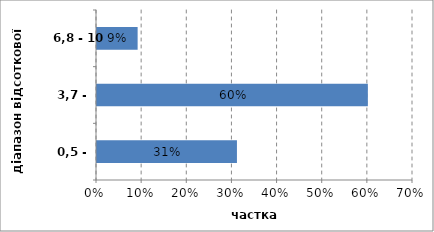
| Category | Series 0 |
|---|---|
| 0,5 - 3,7 | 0.31 |
| 3,7 - 6,8 | 0.6 |
| 6,8 - 10 | 0.09 |